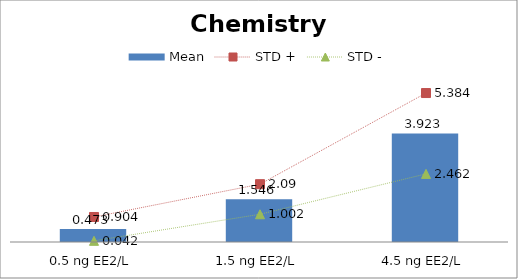
| Category | Mean |
|---|---|
| 0.5 ng EE2/L | 0.473 |
| 1.5 ng EE2/L | 1.546 |
| 4.5 ng EE2/L | 3.923 |